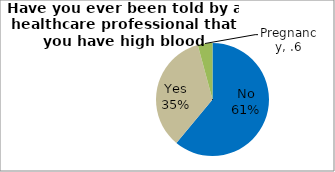
| Category | Series 0 |
|---|---|
| No | 61.039 |
| Yes | 34.758 |
| Pregnancy | 4.203 |